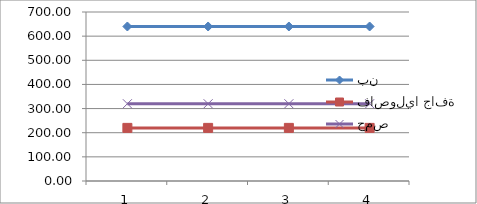
| Category | بن | فاصوليا جافة | حمص |
|---|---|---|---|
| 0 | 640 | 220 | 320 |
| 1 | 640 | 220 | 320 |
| 2 | 640 | 220 | 320 |
| 3 | 640 | 220 | 320 |